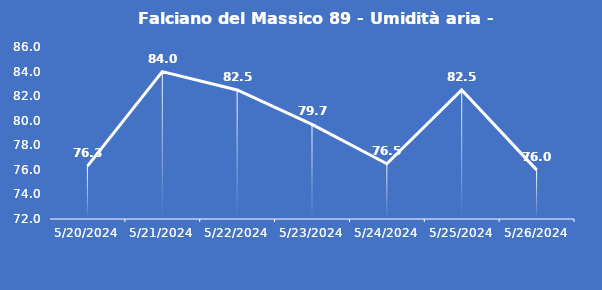
| Category | Falciano del Massico 89 - Umidità aria - Grezzo (%) |
|---|---|
| 5/20/24 | 76.3 |
| 5/21/24 | 84 |
| 5/22/24 | 82.5 |
| 5/23/24 | 79.7 |
| 5/24/24 | 76.5 |
| 5/25/24 | 82.5 |
| 5/26/24 | 76 |